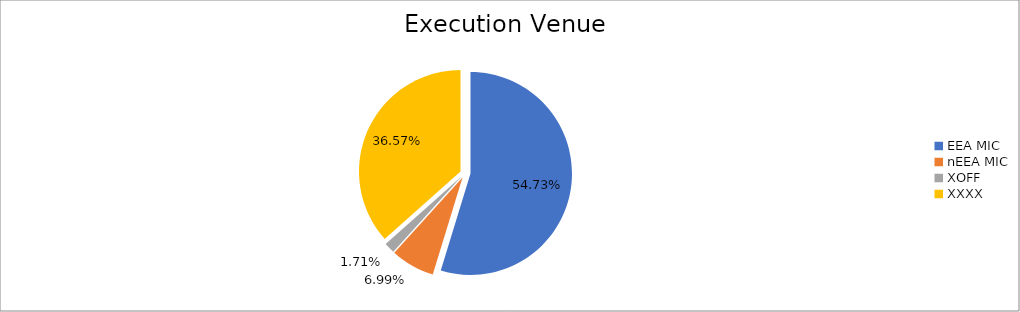
| Category | Series 0 |
|---|---|
| EEA MIC | 6412098.613 |
| nEEA MIC | 818928.115 |
| XOFF | 199936.8 |
| XXXX | 4284410.555 |